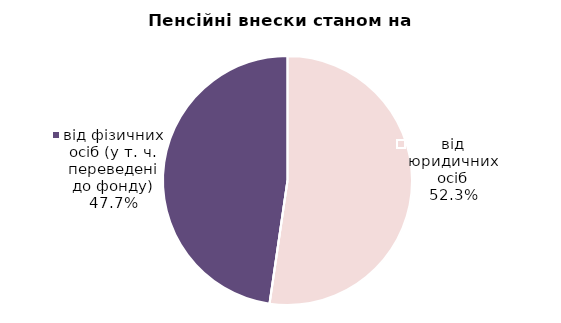
| Category | Series 0 |
|---|---|
| від юридичних осіб | 949.227 |
| від ФОПів | 0.33 |
| від фізичних осіб (у т. ч. переведені до фонду) | 865.633 |